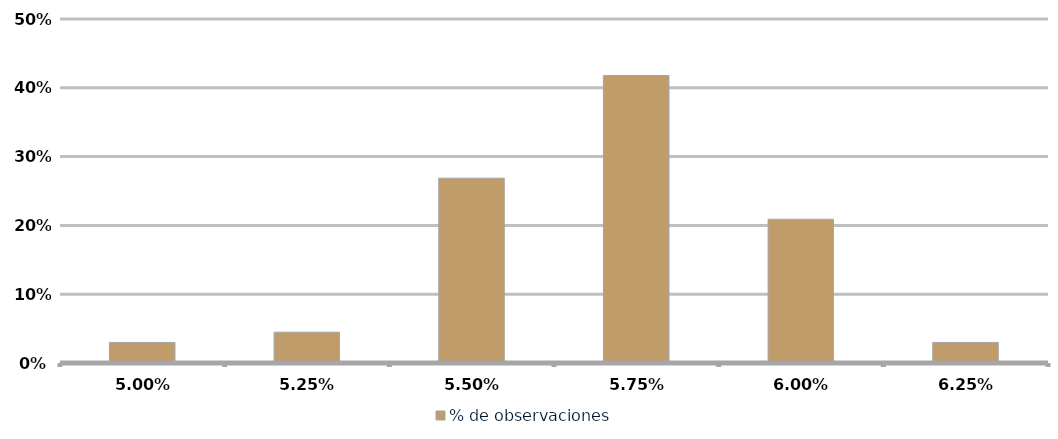
| Category | % de observaciones  |
|---|---|
| 0.049999999999999996 | 0.03 |
| 0.0525 | 0.045 |
| 0.055 | 0.269 |
| 0.0575 | 0.418 |
| 0.060000000000000005 | 0.209 |
| 0.0625 | 0.03 |